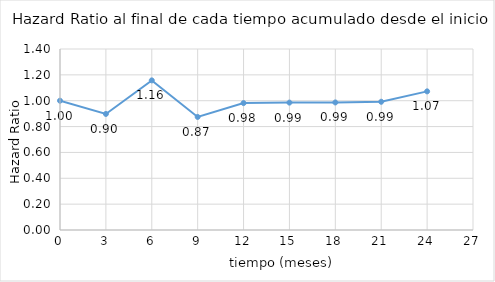
| Category | HRi |
|---|---|
| 0.0 | 1 |
| 3.0 | 0.898 |
| 6.0 | 1.157 |
| 9.0 | 0.875 |
| 12.0 | 0.982 |
| 15.0 | 0.985 |
| 18.0 | 0.987 |
| 21.0 | 0.992 |
| 24.0 | 1.072 |